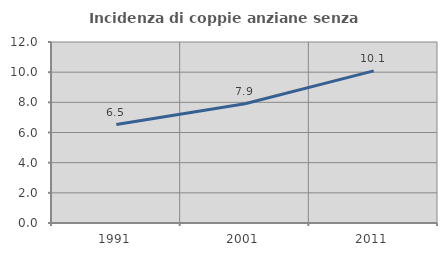
| Category | Incidenza di coppie anziane senza figli  |
|---|---|
| 1991.0 | 6.529 |
| 2001.0 | 7.909 |
| 2011.0 | 10.083 |